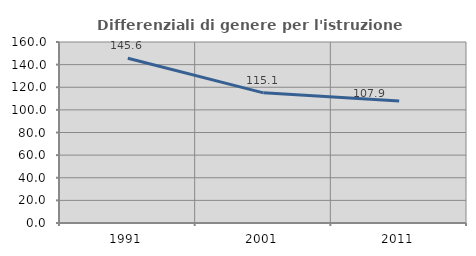
| Category | Differenziali di genere per l'istruzione superiore |
|---|---|
| 1991.0 | 145.587 |
| 2001.0 | 115.063 |
| 2011.0 | 107.881 |